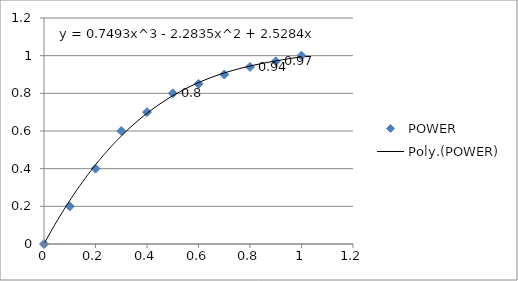
| Category | POWER |
|---|---|
| 0.0 | 0 |
| 0.1 | 0.2 |
| 0.2 | 0.4 |
| 0.3 | 0.6 |
| 0.4 | 0.7 |
| 0.5 | 0.8 |
| 0.6 | 0.85 |
| 0.7 | 0.9 |
| 0.8 | 0.94 |
| 0.9 | 0.97 |
| 1.0 | 1 |